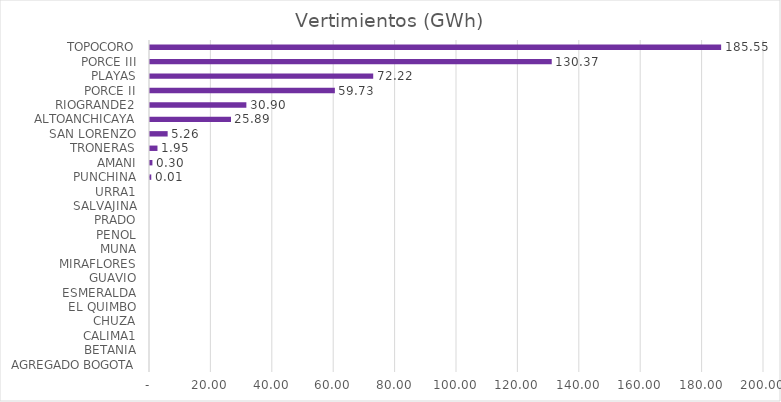
| Category | Vertimientos (GWh) |
|---|---|
| AGREGADO BOGOTA | 0 |
| BETANIA | 0 |
| CALIMA1 | 0 |
| CHUZA | 0 |
| EL QUIMBO | 0 |
| ESMERALDA | 0 |
| GUAVIO | 0 |
| MIRAFLORES | 0 |
| MUNA | 0 |
| PENOL | 0 |
| PRADO | 0 |
| SALVAJINA | 0 |
| URRA1 | 0 |
| PUNCHINA | 0.01 |
| AMANI | 0.299 |
| TRONERAS | 1.946 |
| SAN LORENZO | 5.26 |
| ALTOANCHICAYA | 25.893 |
| RIOGRANDE2 | 30.903 |
| PORCE II | 59.729 |
| PLAYAS | 72.217 |
| PORCE III | 130.37 |
| TOPOCORO | 185.55 |